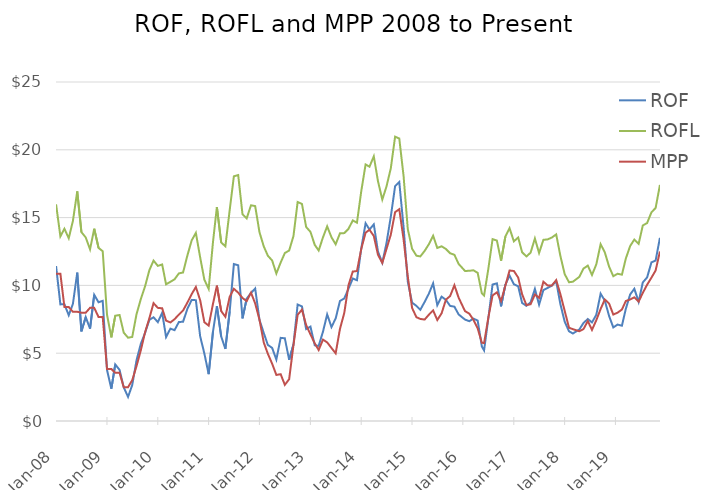
| Category | ROF | ROFL | MPP |
|---|---|---|---|
| 2008-01-01 | 11.43 | 15.983 | 10.864 |
| 2008-02-01 | 8.6 | 13.615 | 10.864 |
| 2008-03-01 | 8.61 | 14.178 | 8.404 |
| 2008-04-01 | 7.8 | 13.477 | 8.404 |
| 2008-05-01 | 8.64 | 14.758 | 8.053 |
| 2008-06-01 | 10.94 | 16.932 | 8.053 |
| 2008-07-01 | 6.61 | 13.933 | 7.989 |
| 2008-08-01 | 7.66 | 13.536 | 7.989 |
| 2008-09-01 | 6.81 | 12.656 | 8.344 |
| 2008-10-01 | 9.31 | 14.18 | 8.344 |
| 2008-11-01 | 8.76 | 12.77 | 7.671 |
| 2008-12-01 | 8.86 | 12.52 | 7.671 |
| 2009-01-01 | 3.76 | 7.832 | 3.835 |
| 2009-02-01 | 2.38 | 6.17 | 3.835 |
| 2009-03-01 | 4.17 | 7.762 | 3.555 |
| 2009-04-01 | 3.77 | 7.817 | 3.555 |
| 2009-05-01 | 2.48 | 6.515 | 2.492 |
| 2009-06-01 | 1.78 | 6.145 | 2.492 |
| 2009-07-01 | 2.65 | 6.197 | 3.009 |
| 2009-08-01 | 4.49 | 7.885 | 4.056 |
| 2009-09-01 | 5.7 | 9.002 | 5.229 |
| 2009-10-01 | 6.49 | 9.925 | 6.54 |
| 2009-11-01 | 7.46 | 11.12 | 7.579 |
| 2009-12-01 | 7.65 | 11.828 | 8.69 |
| 2010-01-01 | 7.29 | 11.439 | 8.343 |
| 2010-02-01 | 7.98 | 11.542 | 8.31 |
| 2010-03-01 | 6.19 | 10.08 | 7.403 |
| 2010-04-01 | 6.81 | 10.262 | 7.267 |
| 2010-05-01 | 6.7 | 10.449 | 7.507 |
| 2010-06-01 | 7.3 | 10.885 | 7.85 |
| 2010-07-01 | 7.32 | 10.951 | 8.146 |
| 2010-08-01 | 8.27 | 12.201 | 8.729 |
| 2010-09-01 | 8.93 | 13.319 | 9.358 |
| 2010-10-01 | 8.91 | 13.871 | 9.883 |
| 2010-11-01 | 6.24 | 12.063 | 8.904 |
| 2010-12-01 | 4.98 | 10.423 | 7.285 |
| 2011-01-01 | 3.45 | 9.741 | 7.034 |
| 2011-02-01 | 6.6 | 13.197 | 8.636 |
| 2011-03-01 | 8.47 | 15.781 | 9.983 |
| 2011-04-01 | 6.23 | 13.163 | 8.103 |
| 2011-05-01 | 5.32 | 12.884 | 7.687 |
| 2011-06-01 | 8.08 | 15.557 | 9.167 |
| 2011-07-01 | 11.57 | 18.045 | 9.75 |
| 2011-08-01 | 11.48 | 18.138 | 9.464 |
| 2011-09-01 | 7.57 | 15.243 | 9.071 |
| 2011-10-01 | 9.02 | 14.944 | 8.842 |
| 2011-11-01 | 9.44 | 15.909 | 9.467 |
| 2011-12-01 | 9.77 | 15.848 | 8.672 |
| 2012-01-01 | 7.45 | 13.919 | 7.461 |
| 2012-02-01 | 6.48 | 12.867 | 5.777 |
| 2012-03-01 | 5.61 | 12.191 | 4.958 |
| 2012-04-01 | 5.39 | 11.833 | 4.221 |
| 2012-05-01 | 4.53 | 10.875 | 3.399 |
| 2012-06-01 | 6.13 | 11.685 | 3.452 |
| 2012-07-01 | 6.1 | 12.385 | 2.668 |
| 2012-08-01 | 4.51 | 12.573 | 3.083 |
| 2012-09-01 | 5.64 | 13.638 | 5.595 |
| 2012-10-01 | 8.59 | 16.151 | 7.832 |
| 2012-11-01 | 8.45 | 16.008 | 8.214 |
| 2012-12-01 | 6.78 | 14.311 | 7.075 |
| 2013-01-01 | 6.96 | 13.946 | 6.39 |
| 2013-02-01 | 5.58 | 12.986 | 5.722 |
| 2013-03-01 | 5.54 | 12.574 | 5.236 |
| 2013-04-01 | 6.59 | 13.544 | 6.002 |
| 2013-05-01 | 7.86 | 14.355 | 5.799 |
| 2013-06-01 | 6.93 | 13.548 | 5.385 |
| 2013-07-01 | 7.56 | 13.031 | 4.991 |
| 2013-08-01 | 8.85 | 13.84 | 6.795 |
| 2013-09-01 | 9.04 | 13.856 | 7.971 |
| 2013-10-01 | 9.75 | 14.166 | 10.004 |
| 2013-11-01 | 10.51 | 14.794 | 11.021 |
| 2013-12-01 | 10.38 | 14.624 | 11.058 |
| 2014-01-01 | 12.73 | 16.95 | 12.693 |
| 2014-02-01 | 14.58 | 18.919 | 13.89 |
| 2014-03-01 | 14.12 | 18.753 | 14.102 |
| 2014-04-01 | 14.5 | 19.517 | 13.647 |
| 2014-05-01 | 12.49 | 17.683 | 12.261 |
| 2014-06-01 | 11.67 | 16.328 | 11.654 |
| 2014-07-01 | 13.11 | 17.293 | 12.683 |
| 2014-08-01 | 15.06 | 18.63 | 13.739 |
| 2014-09-01 | 17.32 | 20.969 | 15.404 |
| 2014-10-01 | 17.62 | 20.831 | 15.619 |
| 2014-11-01 | 14.28 | 18.05 | 13.394 |
| 2014-12-01 | 10.27 | 14.157 | 10.664 |
| 2015-01-01 | 8.73 | 12.704 | 8.336 |
| 2015-02-01 | 8.49 | 12.191 | 7.655 |
| 2015-03-01 | 8.2 | 12.136 | 7.526 |
| 2015-04-01 | 8.78 | 12.542 | 7.482 |
| 2015-05-01 | 9.38 | 13.029 | 7.832 |
| 2015-06-01 | 10.15 | 13.663 | 8.158 |
| 2015-07-01 | 8.54 | 12.761 | 7.447 |
| 2015-08-01 | 9.17 | 12.883 | 7.944 |
| 2015-09-01 | 8.93 | 12.684 | 8.949 |
| 2015-10-01 | 8.49 | 12.37 | 9.215 |
| 2015-11-01 | 8.43 | 12.256 | 10.015 |
| 2015-12-01 | 7.86 | 11.587 | 9.099 |
| 2016-01-16 | 7.48 | 11.065 | 8.105 |
| 2016-02-16 | 7.36 | 11.076 | 7.914 |
| 2016-03-16 | 7.55 | 11.115 | 7.47 |
| 2016-04-16 | 7.41 | 10.927 | 6.83 |
| 2016-05-16 | 5.49 | 9.412 | 5.77 |
| 2016-06-01 | 5.206 | 9.254 | 5.75 |
| 2016-07-01 | 7.527 | 11.182 | 7.59 |
| 2016-08-01 | 10.066 | 13.411 | 9.26 |
| 2016-09-01 | 10.151 | 13.306 | 9.49 |
| 2016-10-01 | 8.456 | 11.824 | 8.85 |
| 2016-11-01 | 10.052 | 13.599 | 9.98 |
| 2016-12-01 | 10.732 | 14.217 | 11.1 |
| 2017-01-01 | 10.084 | 13.25 | 11.06 |
| 2017-02-01 | 9.936 | 13.534 | 10.58 |
| 2017-03-01 | 8.708 | 12.446 | 9.352 |
| 2017-04-01 | 8.494 | 12.136 | 8.55 |
| 2017-05-01 | 8.747 | 12.412 | 8.61 |
| 2017-06-01 | 9.739 | 13.459 | 9.33 |
| 2017-07-01 | 8.578 | 12.388 | 9.08 |
| 2017-08-01 | 9.66 | 13.36 | 10.27 |
| 2017-09-01 | 9.817 | 13.395 | 9.99 |
| 2017-10-01 | 9.98 | 13.532 | 10 |
| 2017-11-01 | 10.304 | 13.762 | 10.39 |
| 2017-12-01 | 8.618 | 12.175 | 9.36 |
| 2018-01-01 | 7.324 | 10.832 | 8.12 |
| 2018-02-01 | 6.617 | 10.232 | 6.88 |
| 2018-03-01 | 6.453 | 10.273 | 6.77 |
| 2018-04-16 | 6.75 | 10.63 | 6.62 |
| 2018-05-16 | 7.23 | 11.24 | 6.78 |
| 2018-06-16 | 7.52 | 11.46 | 7.37 |
| 2018-07-16 | 7.27 | 10.77 | 6.72 |
| 2018-08-16 | 7.83 | 11.55 | 7.43 |
| 2018-09-16 | 9.39 | 13.04 | 8.26 |
| 2018-10-16 | 8.88 | 12.44 | 8.96 |
| 2018-11-16 | 7.74 | 11.38 | 8.66 |
| 2018-12-16 | 6.9 | 10.68 | 7.85 |
| 2019-01-16 | 7.11 | 10.86 | 7.99 |
| 2019-02-16 | 7.03 | 10.79 | 8.22 |
| 2019-03-16 | 8.27 | 11.98 | 8.85 |
| 2019-04-16 | 9.33 | 12.9 | 8.96 |
| 2019-05-16 | 9.75 | 13.38 | 9.12 |
| 2019-06-16 | 8.79 | 13.06 | 8.8 |
| 2019-07-16 | 10.22 | 14.42 | 9.45 |
| 2019-08-16 | 10.59 | 14.6 | 10.05 |
| 2019-09-16 | 11.7 | 15.39 | 10.57 |
| 2019-10-16 | 11.83 | 15.71 | 11.1 |
| 2019-11-16 | 13.51 | 17.41 | 12.5 |